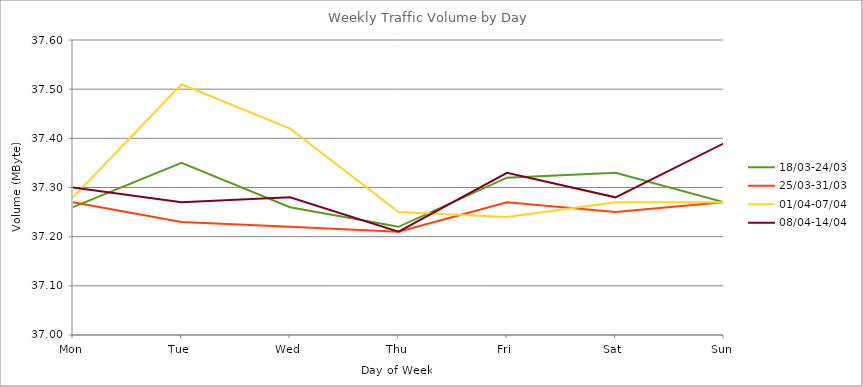
| Category | 18/03-24/03 | 25/03-31/03 | 01/04-07/04 | 08/04-14/04 |
|---|---|---|---|---|
| Mon | 37.26 | 37.27 | 37.28 | 37.3 |
| Tue | 37.35 | 37.23 | 37.51 | 37.27 |
| Wed | 37.26 | 37.22 | 37.42 | 37.28 |
| Thu | 37.22 | 37.21 | 37.25 | 37.21 |
| Fri | 37.32 | 37.27 | 37.24 | 37.33 |
| Sat | 37.33 | 37.25 | 37.27 | 37.28 |
| Sun | 37.27 | 37.27 | 37.27 | 37.39 |